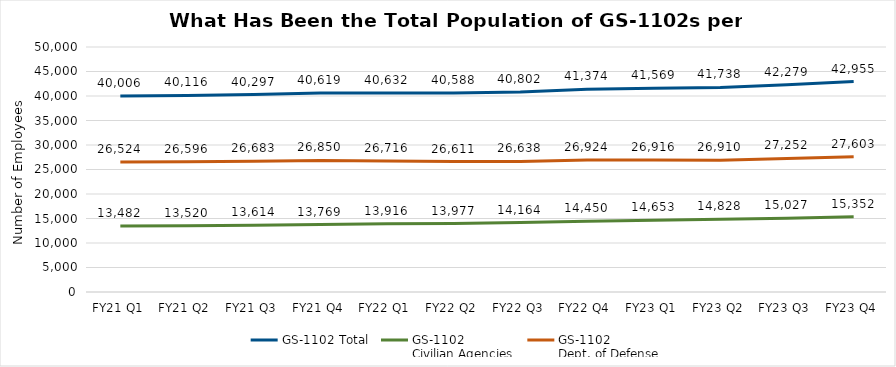
| Category | GS-1102 Total | GS-1102 
Civilian Agencies | GS-1102 
Dept. of Defense |
|---|---|---|---|
| FY21 Q1 | 40006 | 13482 | 26524 |
| FY21 Q2 | 40116 | 13520 | 26596 |
| FY21 Q3 | 40297 | 13614 | 26683 |
| FY21 Q4 | 40619 | 13769 | 26850 |
| FY22 Q1 | 40632 | 13916 | 26716 |
| FY22 Q2 | 40588 | 13977 | 26611 |
| FY22 Q3 | 40802 | 14164 | 26638 |
| FY22 Q4 | 41374 | 14450 | 26924 |
| FY23 Q1 | 41569 | 14653 | 26916 |
| FY23 Q2 | 41738 | 14828 | 26910 |
| FY23 Q3 | 42279 | 15027 | 27252 |
| FY23 Q4 | 42955 | 15352 | 27603 |